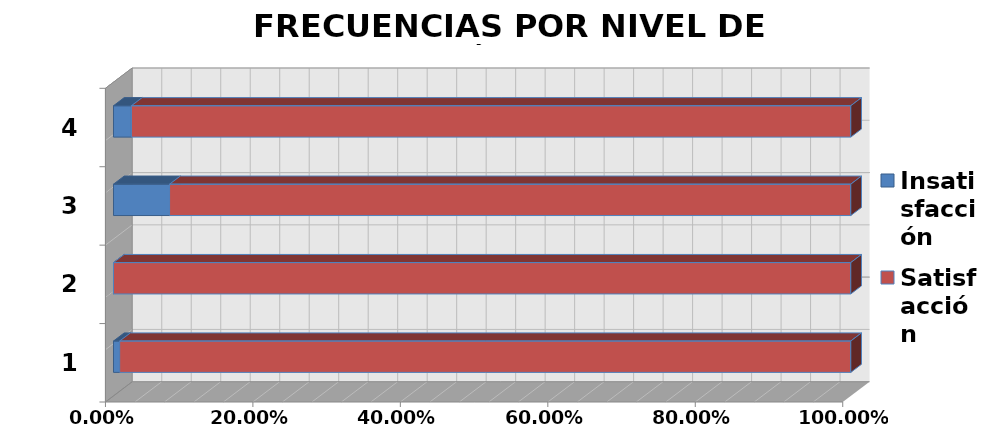
| Category | Insatisfacción | Satisfacción |
|---|---|---|
| 0 | 0.008 | 0.992 |
| 1 | 0 | 1 |
| 2 | 0.076 | 0.924 |
| 3 | 0.024 | 0.976 |